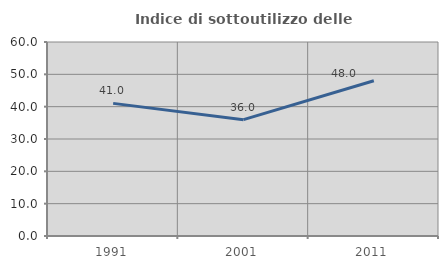
| Category | Indice di sottoutilizzo delle abitazioni  |
|---|---|
| 1991.0 | 41.018 |
| 2001.0 | 35.987 |
| 2011.0 | 48 |